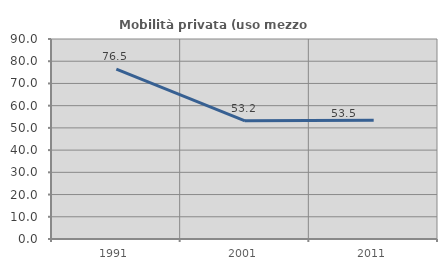
| Category | Mobilità privata (uso mezzo privato) |
|---|---|
| 1991.0 | 76.471 |
| 2001.0 | 53.165 |
| 2011.0 | 53.459 |